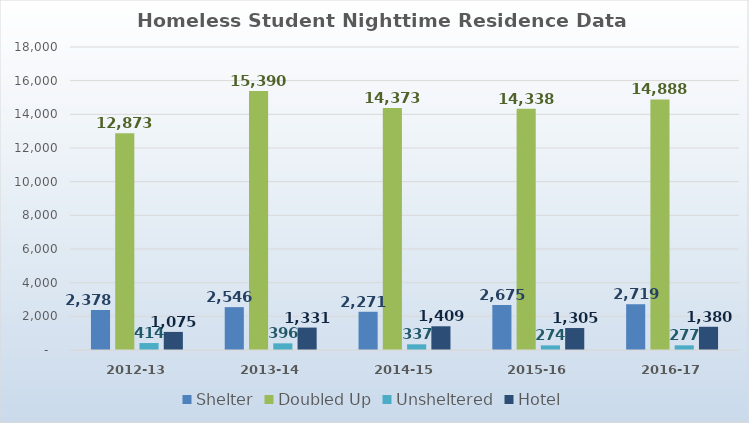
| Category | Shelter | Doubled Up | Unsheltered | Hotel |
|---|---|---|---|---|
| 2012-13 | 2378 | 12873 | 414 | 1075 |
| 2013-14 | 2546 | 15390 | 396 | 1331 |
| 2014-15 | 2271 | 14373 | 337 | 1409 |
| 2015-16 | 2675 | 14338 | 274 | 1305 |
| 2016-17 | 2719 | 14888 | 277 | 1380 |